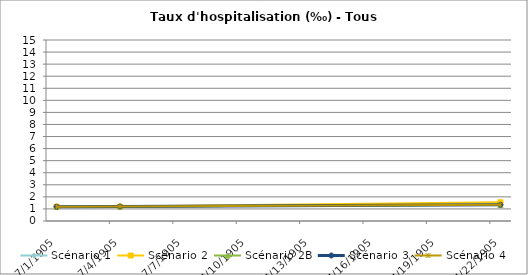
| Category | Scénario 1 | Scénario 2 | Scénario 2B | Scénario 3 | Scénario 4 |
|---|---|---|---|---|---|
| 2009.0 | 1.184 | 1.184 | 1.184 | 1.184 | 1.184 |
| 2012.0 | 1.197 | 1.197 | 1.197 | 1.197 | 1.197 |
| 2030.0 | 1.341 | 1.552 | 1.341 | 1.341 | 1.341 |